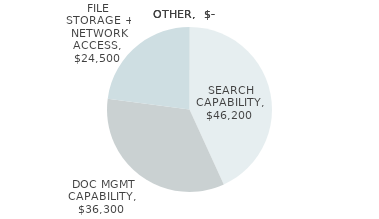
| Category | Series 0 | Series 1 | Series 2 |
|---|---|---|---|
| SEARCH CAPABILITY | 46200 | 46200 | 46200 |
| DOC MGMT CAPABILITY | 36300 | 36300 | 36300 |
| FILE STORAGE + NETWORK ACCESS | 24500 | 24500 | 24500 |
| OTHER | 0 | 0 | 0 |
| OTHER | 0 | 0 | 0 |
| OTHER | 0 | 0 | 0 |